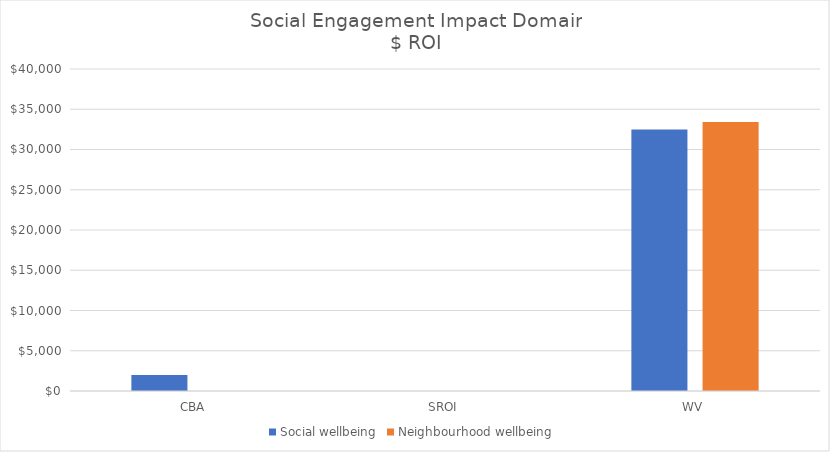
| Category | Social wellbeing | Neighbourhood wellbeing  |
|---|---|---|
| CBA | 1988.1 | 0 |
| SROI | 0 | 0 |
| WV | 32481.9 | 33423.7 |